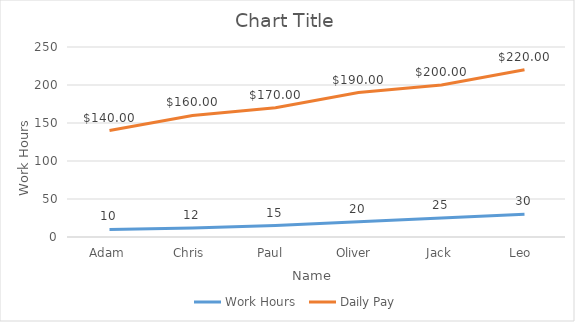
| Category | Work Hours  | Daily Pay  |
|---|---|---|
| Adam | 10 | 140 |
| Chris  | 12 | 160 |
| Paul  | 15 | 170 |
| Oliver  | 20 | 190 |
| Jack | 25 | 200 |
| Leo  | 30 | 220 |